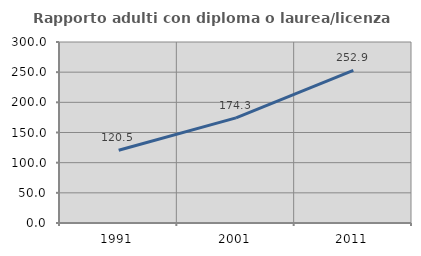
| Category | Rapporto adulti con diploma o laurea/licenza media  |
|---|---|
| 1991.0 | 120.475 |
| 2001.0 | 174.295 |
| 2011.0 | 252.896 |